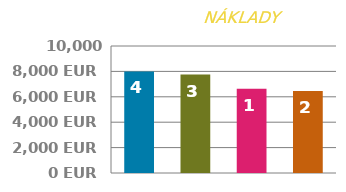
| Category | PLATBA |
|---|---|
| 0 | 8000 |
| 1 | 7750 |
| 2 | 6625 |
| 3 | 6450 |